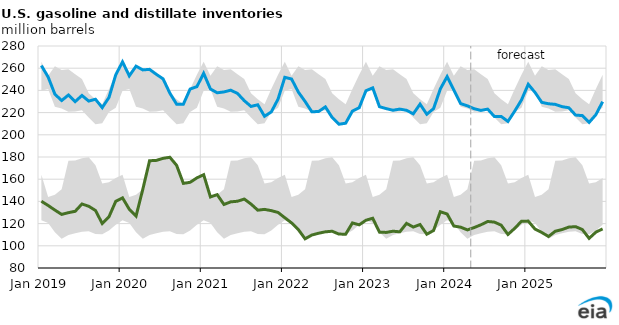
| Category | Distillate inventories | Gasoline inventories |
|---|---|---|
| 2019-01-01 | 140.129 | 262.366 |
| 2019-02-01 | 136.323 | 252.058 |
| 2019-03-01 | 132.172 | 236.555 |
| 2019-04-01 | 128.274 | 230.869 |
| 2019-05-01 | 129.865 | 235.83 |
| 2019-06-01 | 131.094 | 229.914 |
| 2019-07-01 | 137.674 | 235.434 |
| 2019-08-01 | 135.636 | 230.362 |
| 2019-09-01 | 131.838 | 232.043 |
| 2019-10-01 | 120.073 | 224.473 |
| 2019-11-01 | 126.221 | 233.691 |
| 2019-12-01 | 140.083 | 254.1 |
| 2020-01-01 | 143.19 | 265.711 |
| 2020-02-01 | 132.918 | 253.091 |
| 2020-03-01 | 126.782 | 261.823 |
| 2020-04-01 | 150.922 | 258.463 |
| 2020-05-01 | 176.627 | 258.952 |
| 2020-06-01 | 176.947 | 254.479 |
| 2020-07-01 | 178.8 | 250.36 |
| 2020-08-01 | 179.763 | 237.534 |
| 2020-09-01 | 172.502 | 227.578 |
| 2020-10-01 | 156.235 | 227.616 |
| 2020-11-01 | 157.205 | 241.23 |
| 2020-12-01 | 161.188 | 243.395 |
| 2021-01-01 | 164.058 | 255.362 |
| 2021-02-01 | 144.012 | 241.273 |
| 2021-03-01 | 146.079 | 237.846 |
| 2021-04-01 | 137.218 | 238.622 |
| 2021-05-01 | 139.6 | 240.176 |
| 2021-06-01 | 140.133 | 237.286 |
| 2021-07-01 | 142.139 | 230.765 |
| 2021-08-01 | 137.625 | 225.551 |
| 2021-09-01 | 132.095 | 227.048 |
| 2021-10-01 | 132.811 | 216.696 |
| 2021-11-01 | 131.692 | 220.598 |
| 2021-12-01 | 130.039 | 232.178 |
| 2022-01-01 | 125.282 | 251.781 |
| 2022-02-01 | 120.61 | 250.261 |
| 2022-03-01 | 114.658 | 238.502 |
| 2022-04-01 | 106.291 | 230.019 |
| 2022-05-01 | 109.712 | 220.722 |
| 2022-06-01 | 111.329 | 221.016 |
| 2022-07-01 | 112.591 | 225.133 |
| 2022-08-01 | 113.122 | 215.591 |
| 2022-09-01 | 110.531 | 209.516 |
| 2022-10-01 | 110.492 | 210.444 |
| 2022-11-01 | 120.601 | 221.354 |
| 2022-12-01 | 118.899 | 224.41 |
| 2023-01-01 | 123.013 | 239.706 |
| 2023-02-01 | 124.821 | 242.298 |
| 2023-03-01 | 112.292 | 225.333 |
| 2023-04-01 | 112.061 | 223.591 |
| 2023-05-01 | 113.14 | 222.113 |
| 2023-06-01 | 112.598 | 223.162 |
| 2023-07-01 | 120.208 | 222.05 |
| 2023-08-01 | 116.89 | 218.901 |
| 2023-09-01 | 119.17 | 227.622 |
| 2023-10-01 | 110.433 | 218.54 |
| 2023-11-01 | 113.783 | 223.607 |
| 2023-12-01 | 130.713 | 241.321 |
| 2024-01-01 | 128.691 | 252.392 |
| 2024-02-01 | 117.796 | 240.217 |
| 2024-03-01 | 116.78 | 228.122 |
| 2024-04-01 | 114.33 | 226.108 |
| 2024-05-01 | 116.41 | 223.511 |
| 2024-06-01 | 118.921 | 221.977 |
| 2024-07-01 | 121.908 | 223.14 |
| 2024-08-01 | 121.335 | 216.428 |
| 2024-09-01 | 118.578 | 216.542 |
| 2024-10-01 | 110.196 | 212.031 |
| 2024-11-01 | 115.759 | 221.344 |
| 2024-12-01 | 122.098 | 231.38 |
| 2025-01-01 | 122.246 | 245.5 |
| 2025-02-01 | 115.057 | 238.219 |
| 2025-03-01 | 111.991 | 229.22 |
| 2025-04-01 | 108.4 | 227.961 |
| 2025-05-01 | 113.126 | 227.427 |
| 2025-06-01 | 114.643 | 225.359 |
| 2025-07-01 | 116.849 | 224.376 |
| 2025-08-01 | 117.245 | 217.769 |
| 2025-09-01 | 114.655 | 217.291 |
| 2025-10-01 | 106.703 | 211.136 |
| 2025-11-01 | 112.295 | 218.09 |
| 2025-12-01 | 115.254 | 229.837 |